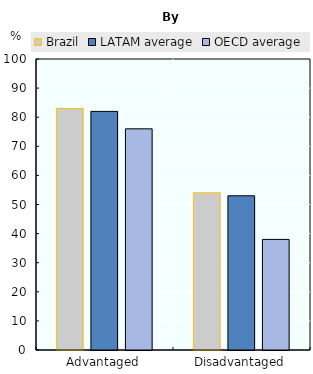
| Category | Brazil | LATAM average | OECD average |
|---|---|---|---|
| Advantaged | 83 | 82 | 76 |
| Disadvantaged | 54 | 53 | 38 |